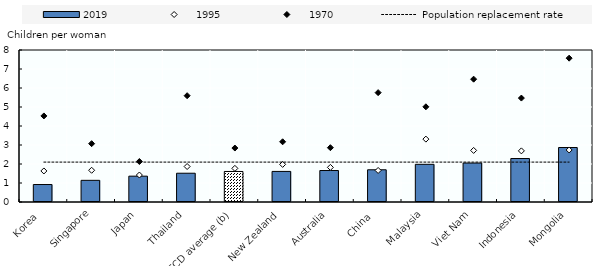
| Category | 2019 |
|---|---|
| Korea  | 0.92 |
| Singapore | 1.14 |
| Japan | 1.36 |
| Thailand | 1.514 |
| OECD average (b) | 1.607 |
| New Zealand | 1.61 |
| Australia | 1.657 |
| China  | 1.696 |
| Malaysia | 1.983 |
| Viet Nam | 2.05 |
| Indonesia | 2.288 |
| Mongolia | 2.867 |